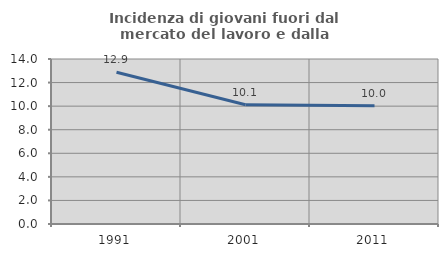
| Category | Incidenza di giovani fuori dal mercato del lavoro e dalla formazione  |
|---|---|
| 1991.0 | 12.874 |
| 2001.0 | 10.121 |
| 2011.0 | 10.037 |